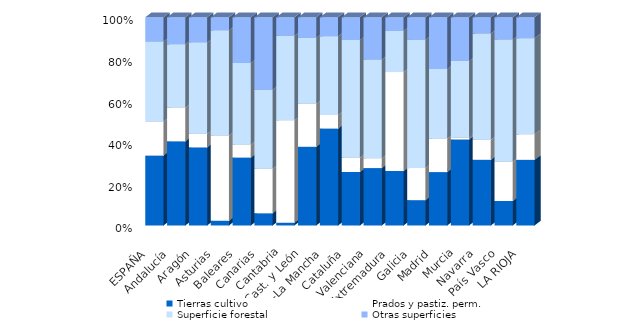
| Category | Tierras cultivo | Prados y pastiz. perm. | Superficie forestal | Otras superficies |
|---|---|---|---|---|
| ESPAÑA | 33.571 | 16.373 | 38.392 | 11.665 |
| Andalucía | 40.427 | 16.207 | 30.452 | 12.914 |
| Aragón | 37.506 | 6.524 | 43.902 | 12.069 |
| Asturias | 2.263 | 40.982 | 50.518 | 6.237 |
| Baleares | 32.621 | 6.277 | 39.148 | 21.954 |
| Canarias | 5.869 | 21.323 | 38.007 | 34.801 |
| Cantabria | 1.338 | 49.145 | 40.656 | 8.86 |
| Cast. y León | 37.787 | 20.646 | 31.722 | 9.845 |
| C.-La Mancha | 46.556 | 6.511 | 37.844 | 9.09 |
| Cataluña | 25.674 | 6.829 | 56.559 | 10.938 |
| C. Valenciana | 27.555 | 4.742 | 47.37 | 20.333 |
| Extremadura | 26.113 | 47.535 | 19.825 | 6.527 |
| Galicia | 12.162 | 15.39 | 61.617 | 10.832 |
| Madrid | 25.628 | 16.133 | 33.324 | 24.916 |
| Murcia | 41.324 | 1.068 | 36.63 | 20.978 |
| Navarra | 31.538 | 9.601 | 51.072 | 7.789 |
| País Vasco | 11.75 | 18.883 | 58.659 | 10.709 |
| LA RIOJA | 31.516 | 12.247 | 46.175 | 10.062 |